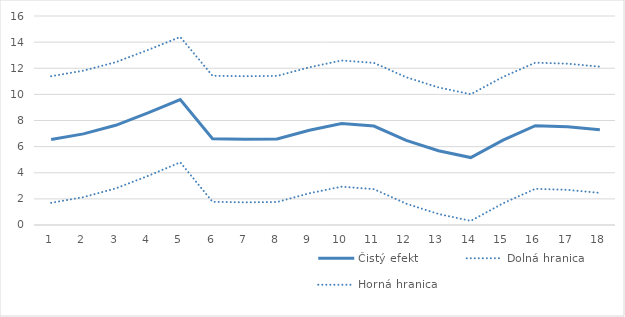
| Category | Čistý efekt | Dolná hranica | Horná hranica |
|---|---|---|---|
| 1.0 | 6.543 | 1.697 | 11.389 |
| 2.0 | 6.975 | 2.134 | 11.816 |
| 3.0 | 7.633 | 2.801 | 12.465 |
| 4.0 | 8.578 | 3.757 | 13.398 |
| 5.0 | 9.596 | 4.796 | 14.395 |
| 6.0 | 6.598 | 1.774 | 11.423 |
| 7.0 | 6.564 | 1.735 | 11.392 |
| 8.0 | 6.586 | 1.76 | 11.412 |
| 9.0 | 7.252 | 2.429 | 12.074 |
| 10.0 | 7.763 | 2.933 | 12.594 |
| 11.0 | 7.578 | 2.745 | 12.412 |
| 12.0 | 6.473 | 1.633 | 11.313 |
| 13.0 | 5.687 | 0.842 | 10.533 |
| 14.0 | 5.163 | 0.315 | 10.011 |
| 15.0 | 6.497 | 1.657 | 11.337 |
| 16.0 | 7.599 | 2.771 | 12.427 |
| 17.0 | 7.52 | 2.692 | 12.348 |
| 18.0 | 7.29 | 2.458 | 12.122 |